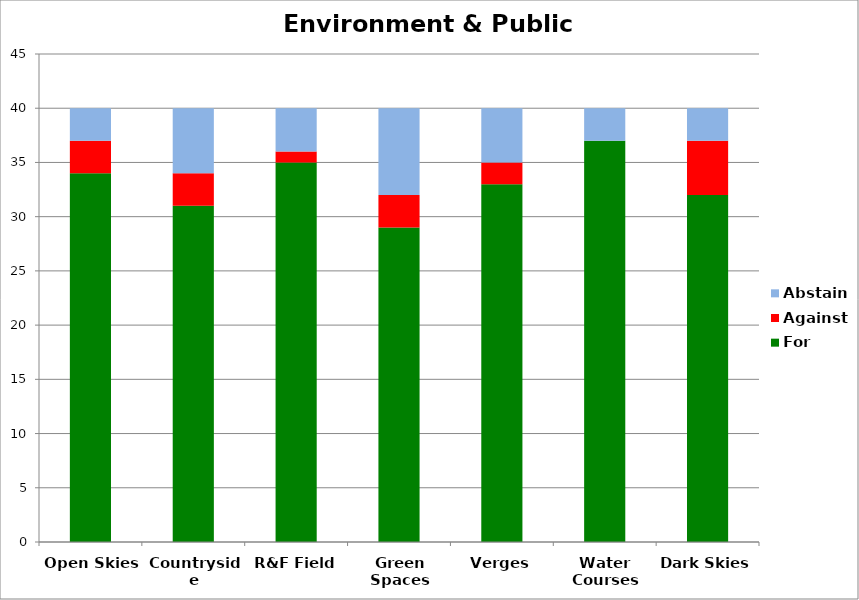
| Category | For | Against | Abstain |
|---|---|---|---|
| Open Skies | 34 | 3 | 3 |
| Countryside | 31 | 3 | 6 |
| R&F Field | 35 | 1 | 4 |
| Green Spaces | 29 | 3 | 8 |
| Verges | 33 | 2 | 5 |
| Water Courses | 37 | 0 | 3 |
| Dark Skies | 32 | 5 | 3 |